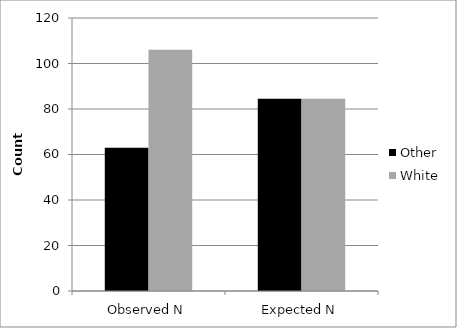
| Category | Other | White |
|---|---|---|
| Observed N | 63 | 106 |
| Expected N | 84.5 | 84.5 |